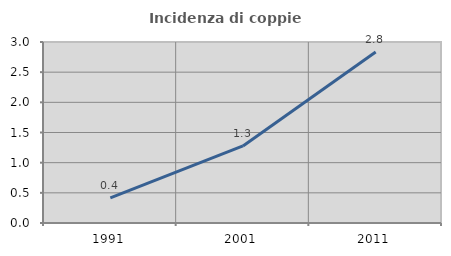
| Category | Incidenza di coppie miste |
|---|---|
| 1991.0 | 0.417 |
| 2001.0 | 1.277 |
| 2011.0 | 2.834 |